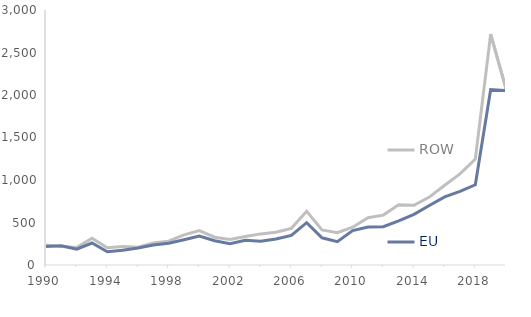
| Category | ROW | EU |
|---|---|---|
| 1990.0 | 234 | 218 |
| 1991.0 | 218 | 227 |
| 1992.0 | 206 | 186 |
| 1993.0 | 316 | 259 |
| 1994.0 | 204 | 155 |
| 1995.0 | 217 | 174 |
| 1996.0 | 208 | 200 |
| 1997.0 | 258 | 235 |
| 1998.0 | 281 | 255 |
| 1999.0 | 354 | 297 |
| 2000.0 | 404 | 340 |
| 2001.0 | 327 | 285 |
| 2002.0 | 299 | 250 |
| 2003.0 | 336 | 291 |
| 2004.0 | 366 | 279 |
| 2005.0 | 385 | 306 |
| 2006.0 | 431 | 349 |
| 2007.0 | 631 | 498 |
| 2008.0 | 412 | 320 |
| 2009.0 | 380 | 275 |
| 2010.0 | 445 | 405 |
| 2011.0 | 556 | 447 |
| 2012.0 | 587 | 450 |
| 2013.0 | 710 | 518 |
| 2014.0 | 702 | 596 |
| 2015.0 | 799 | 700 |
| 2016.0 | 938 | 801 |
| 2017.0 | 1072 | 867 |
| 2018.0 | 1246 | 944 |
| 2019.0 | 2716 | 2064 |
| 2020.0 | 2073 | 2051 |